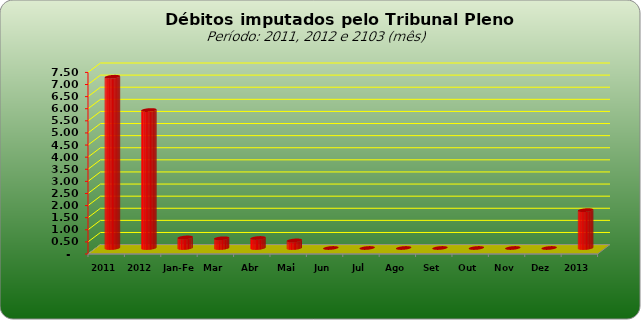
| Category |  7.073.154,74   5.698.720,25   436.112,79   401.482,76   413.229,26   313.253,71   -     -     -     -     -     -     -     1.564.078,52  |
|---|---|
| 2011 | 7073154.74 |
| 2012 | 5698720.25 |
| Jan-Fev | 436112.79 |
| Mar | 401482.76 |
| Abr | 413229.26 |
| Mai | 313253.71 |
| Jun | 0 |
| Jul | 0 |
| Ago | 0 |
| Set | 0 |
| Out | 0 |
| Nov | 0 |
| Dez | 0 |
| 2013 | 1564078.52 |